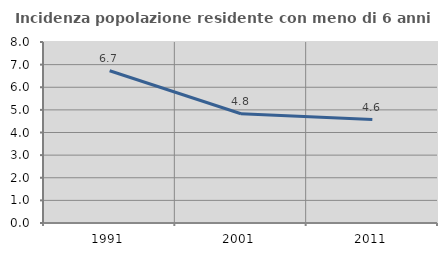
| Category | Incidenza popolazione residente con meno di 6 anni |
|---|---|
| 1991.0 | 6.731 |
| 2001.0 | 4.829 |
| 2011.0 | 4.57 |